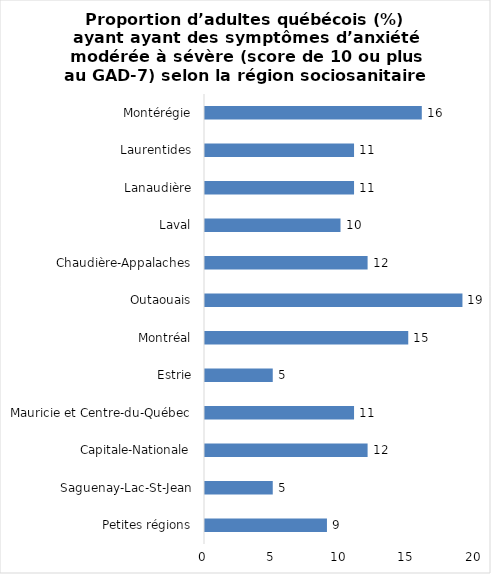
| Category | Series 0 |
|---|---|
| Petites régions | 9 |
| Saguenay-Lac-St-Jean | 5 |
| Capitale-Nationale | 12 |
| Mauricie et Centre-du-Québec | 11 |
| Estrie | 5 |
| Montréal | 15 |
| Outaouais | 19 |
| Chaudière-Appalaches | 12 |
| Laval | 10 |
| Lanaudière | 11 |
| Laurentides | 11 |
| Montérégie | 16 |